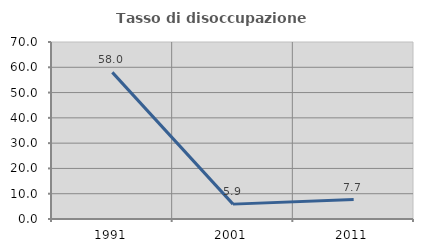
| Category | Tasso di disoccupazione giovanile  |
|---|---|
| 1991.0 | 57.988 |
| 2001.0 | 5.882 |
| 2011.0 | 7.692 |